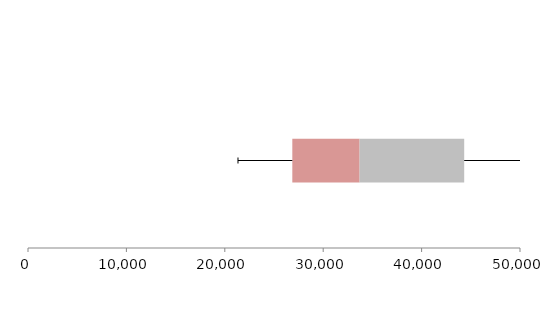
| Category | Series 1 | Series 2 | Series 3 |
|---|---|---|---|
| 0 | 26861.26 | 6837.995 | 10629.301 |